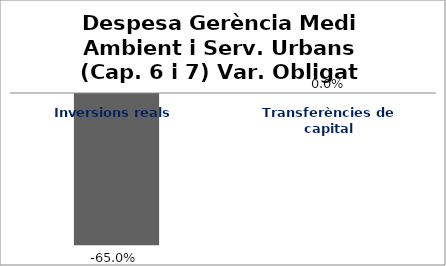
| Category | Series 0 |
|---|---|
| Inversions reals | -0.65 |
| Transferències de capital | 0 |